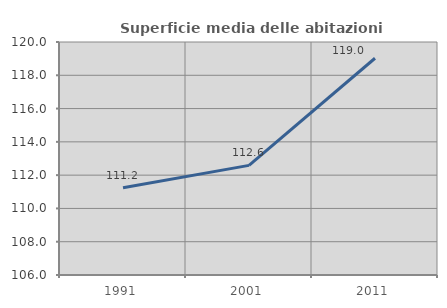
| Category | Superficie media delle abitazioni occupate |
|---|---|
| 1991.0 | 111.248 |
| 2001.0 | 112.588 |
| 2011.0 | 119.024 |